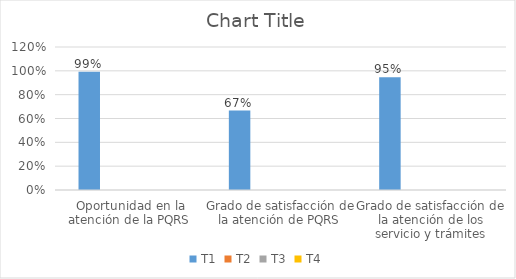
| Category | T1 | T2 | T3 | T4 |
|---|---|---|---|---|
| Oportunidad en la atención de la PQRS  | 0.993 |  |  |  |
| Grado de satisfacción de la atención de PQRS  | 0.667 |  |  |  |
| Grado de satisfacción de la atención de los servicio y trámites | 0.947 |  |  |  |